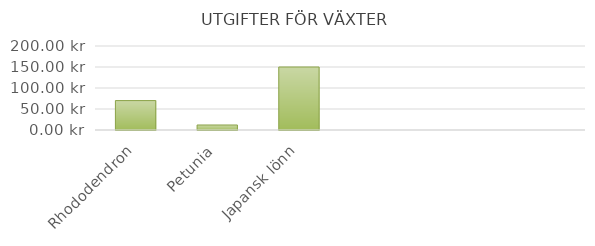
| Category | Rhododendron |
|---|---|
| Rhododendron | 70 |
| Petunia | 11.94 |
| Japansk lönn | 150 |